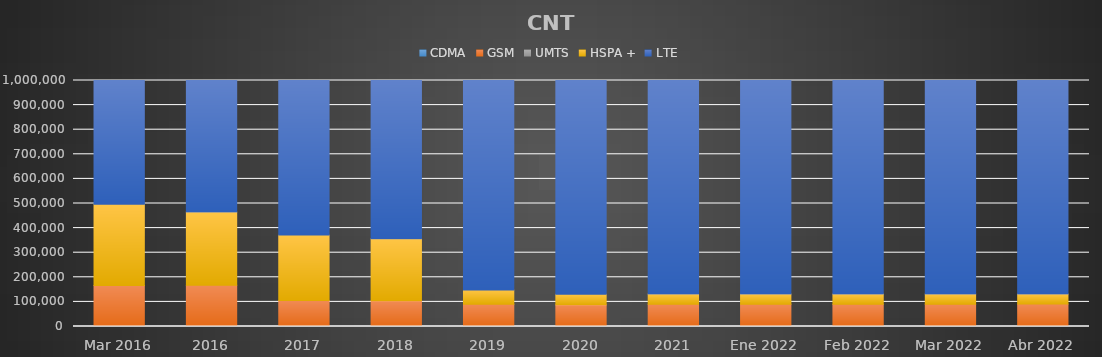
| Category | CDMA | GSM | UMTS | HSPA + | LTE |
|---|---|---|---|---|---|
| Mar 2016 | 0 | 166950 | 0 | 329835 | 678162 |
| 2016 | 0 | 167794 | 0 | 297924 | 1075501 |
| 2017 | 0 | 105840 | 0 | 265966 | 1770311 |
| 2018 | 0 | 104907 | 0 | 252233 | 2488002 |
| 2019 | 0 | 90785 | 0 | 57576 | 2755329 |
| 2020 | 0 | 88328 | 0 | 42633 | 2695427 |
| 2021 | 0 | 90490 | 0 | 41720 | 2737207 |
| Ene 2022 | 0 | 90494 | 0 | 41783 | 2747791 |
| Feb 2022 | 0 | 90620 | 0 | 41640 | 2753688 |
| Mar 2022 | 0 | 90669 | 0 | 41489 | 2761348 |
| Abr 2022 | 0 | 91159 | 0 | 41412 | 2772081 |